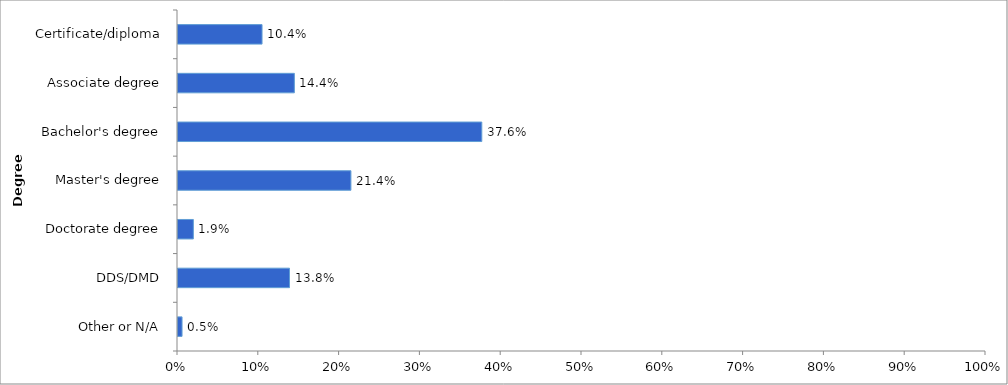
| Category | Series 0 |
|---|---|
| Other or N/A | 0.005 |
| DDS/DMD | 0.138 |
| Doctorate degree | 0.019 |
| Master's degree | 0.214 |
| Bachelor's degree | 0.376 |
| Associate degree | 0.144 |
| Certificate/diploma | 0.104 |